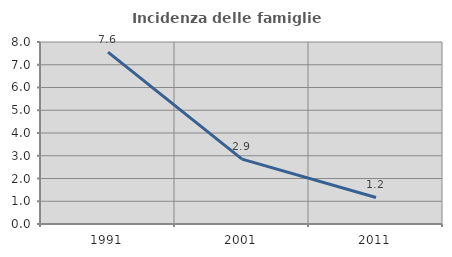
| Category | Incidenza delle famiglie numerose |
|---|---|
| 1991.0 | 7.556 |
| 2001.0 | 2.851 |
| 2011.0 | 1.167 |